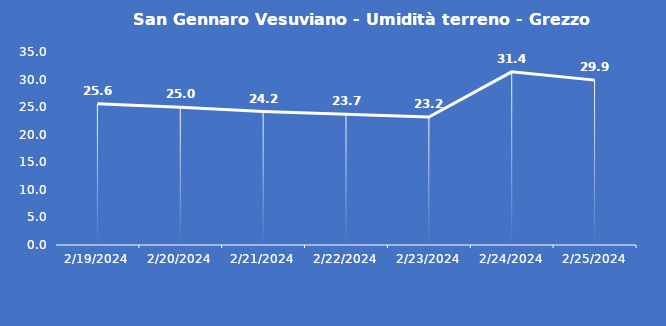
| Category | San Gennaro Vesuviano - Umidità terreno - Grezzo (%VWC) |
|---|---|
| 2/19/24 | 25.6 |
| 2/20/24 | 25 |
| 2/21/24 | 24.2 |
| 2/22/24 | 23.7 |
| 2/23/24 | 23.2 |
| 2/24/24 | 31.4 |
| 2/25/24 | 29.9 |